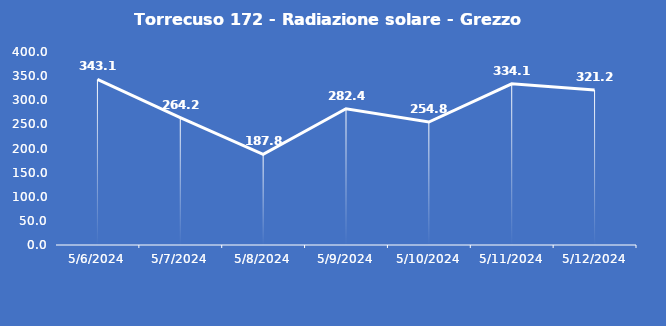
| Category | Torrecuso 172 - Radiazione solare - Grezzo (W/m2) |
|---|---|
| 5/6/24 | 343.1 |
| 5/7/24 | 264.2 |
| 5/8/24 | 187.8 |
| 5/9/24 | 282.4 |
| 5/10/24 | 254.8 |
| 5/11/24 | 334.1 |
| 5/12/24 | 321.2 |